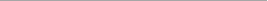
| Category | #ΑΝΑΦ! |
|---|---|
| 1.0 | 1 |